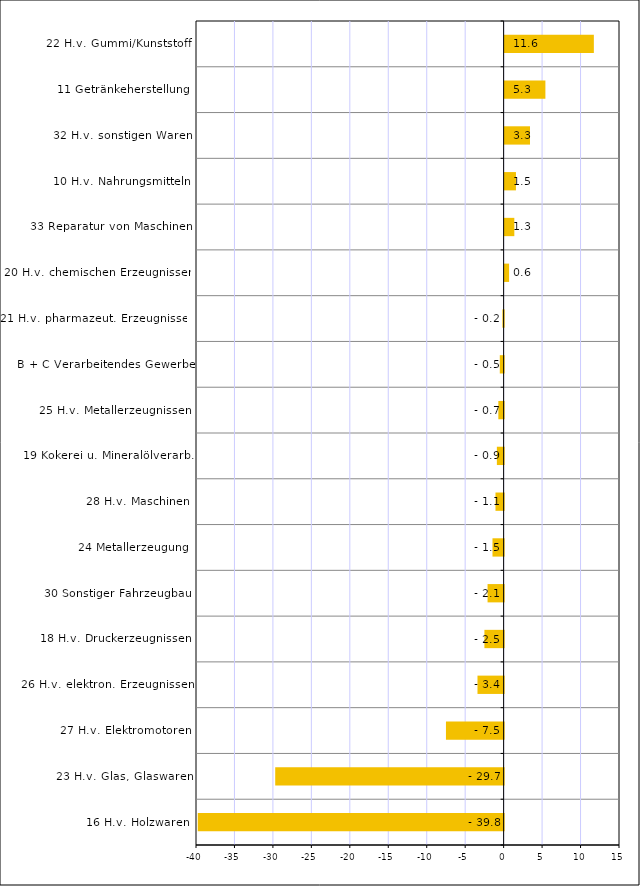
| Category | Series 0 |
|---|---|
| 16 H.v. Holzwaren | -39.77 |
| 23 H.v. Glas, Glaswaren | -29.7 |
| 27 H.v. Elektromotoren | -7.5 |
| 26 H.v. elektron. Erzeugnissen | -3.4 |
| 18 H.v. Druckerzeugnissen | -2.5 |
| 30 Sonstiger Fahrzeugbau | -2.09 |
| 24 Metallerzeugung | -1.45 |
| 28 H.v. Maschinen | -1.06 |
| 19 Kokerei u. Mineralölverarb. | -0.88 |
| 25 H.v. Metallerzeugnissen | -0.69 |
| B + C Verarbeitendes Gewerbe | -0.5 |
| 21 H.v. pharmazeut. Erzeugnissen | -0.16 |
| 20 H.v. chemischen Erzeugnissen | 0.58 |
| 33 Reparatur von Maschinen | 1.26 |
| 10 H.v. Nahrungsmitteln | 1.47 |
| 32 H.v. sonstigen Waren | 3.3 |
| 11 Getränkeherstellung | 5.3 |
| 22 H.v. Gummi/Kunststoff | 11.6 |